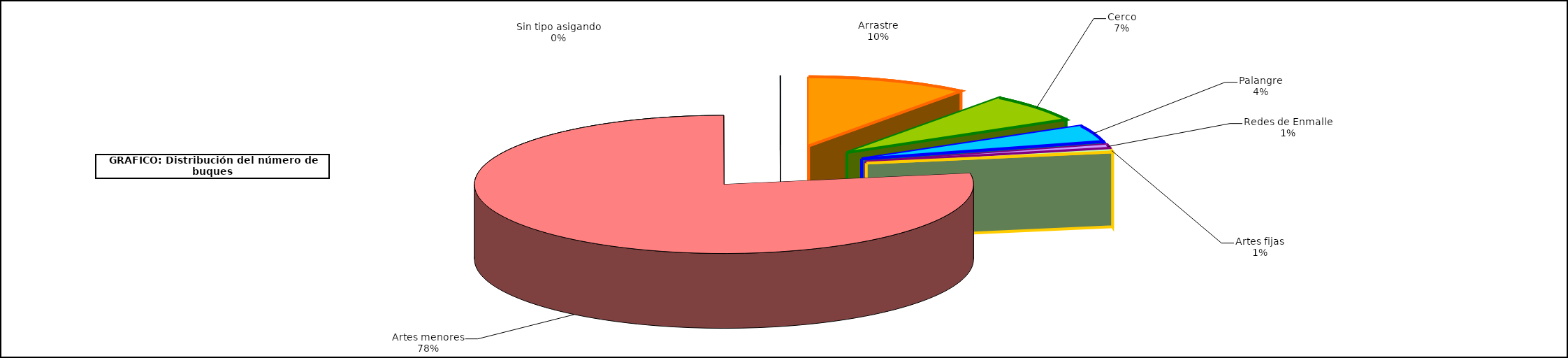
| Category | Series 0 |
|---|---|
| 0 | 1007 |
| 1 | 637 |
| 2 | 373 |
| 3 | 81 |
| 4 | 62 |
| 5 | 7473 |
| 6 | 2 |